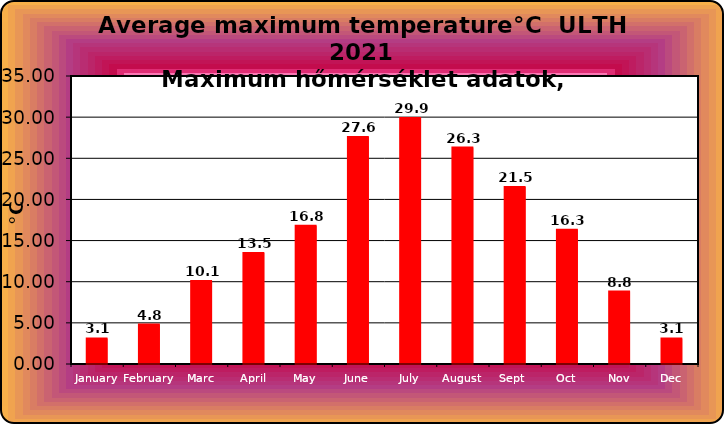
| Category | Series 0 |
|---|---|
| January | 3.1 |
| February | 4.8 |
| Marc | 10.1 |
| April | 13.5 |
| May | 16.8 |
| June | 27.6 |
| July | 29.9 |
| August | 26.3 |
| Sept  | 21.5 |
| Oct | 16.3 |
| Nov | 8.8 |
| Dec | 3.1 |